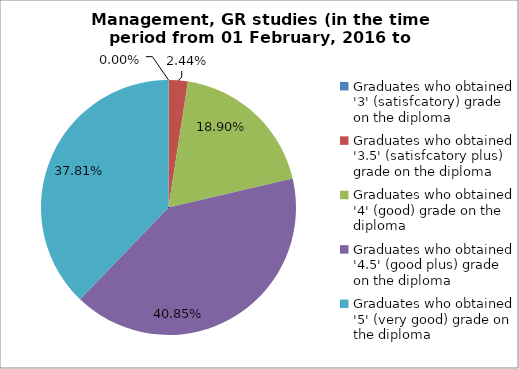
| Category | Series 0 |
|---|---|
| Graduates who obtained '3' (satisfcatory) grade on the diploma  | 0 |
| Graduates who obtained '3.5' (satisfcatory plus) grade on the diploma  | 2.439 |
| Graduates who obtained '4' (good) grade on the diploma  | 18.902 |
| Graduates who obtained '4.5' (good plus) grade on the diploma  | 40.854 |
| Graduates who obtained '5' (very good) grade on the diploma  | 37.805 |